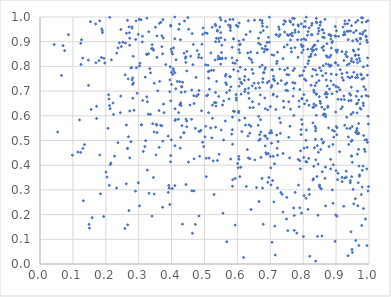
| Category | Series 0 |
|---|---|
| 0.7711605829372568 | 0.711 |
| 0.8751625421166362 | 0.639 |
| 0.39453903070508095 | 0.697 |
| 0.8493857288119423 | 0.313 |
| 0.7195158844886088 | 0.812 |
| 0.27645805787305816 | 0.495 |
| 0.41170801864062745 | 0.585 |
| 0.6354703414734795 | 0.834 |
| 0.5506956713426243 | 0.543 |
| 0.3078551616094081 | 0.563 |
| 0.99832402196587 | 0.314 |
| 0.7428087557466541 | 0.985 |
| 0.9177270872909922 | 0.86 |
| 0.8621516920657131 | 0.494 |
| 0.5855382740461242 | 0.485 |
| 0.7195075052622896 | 0.522 |
| 0.9010816518673722 | 0.767 |
| 0.558158456904702 | 0.66 |
| 0.9147110279898966 | 0.628 |
| 0.5932864767063306 | 0.347 |
| 0.30235069661488817 | 0.802 |
| 0.1691621167150901 | 0.972 |
| 0.9329010332055457 | 0.775 |
| 0.21575233062682514 | 0.409 |
| 0.5095888499351072 | 0.684 |
| 0.6019825847755642 | 0.962 |
| 0.41004457369203334 | 0.479 |
| 0.9072391111265058 | 0.922 |
| 0.9965453725083775 | 0.985 |
| 0.4460981587290986 | 0.782 |
| 0.5651675680994291 | 0.768 |
| 0.37264741824684083 | 0.23 |
| 0.5329063640033712 | 0.971 |
| 0.8928878745340253 | 0.514 |
| 0.7565571000430683 | 0.766 |
| 0.7387678521535422 | 0.448 |
| 0.9638483434946638 | 0.766 |
| 0.5673042113792204 | 0.694 |
| 0.5208401684835107 | 0.784 |
| 0.5320868761976879 | 0.826 |
| 0.713725984316383 | 0.153 |
| 0.7692572739563064 | 0.783 |
| 0.5452912526476306 | 0.835 |
| 0.9651988906121346 | 0.651 |
| 0.8976293564046353 | 0.814 |
| 0.6556205656251907 | 0.712 |
| 0.6580528443994358 | 0.31 |
| 0.8236654320407847 | 0.724 |
| 0.424644073304481 | 0.645 |
| 0.2762782842435201 | 0.793 |
| 0.8270115831850884 | 0.928 |
| 0.6224490643679649 | 0.698 |
| 0.9670124829021873 | 0.532 |
| 0.9473822885446638 | 0.354 |
| 0.8395232519904454 | 0.98 |
| 0.6054603685863158 | 0.976 |
| 0.6676435004039112 | 0.523 |
| 0.8400344397815985 | 0.687 |
| 0.6689526287448277 | 0.988 |
| 0.8592218468099098 | 0.919 |
| 0.9780697841130057 | 0.679 |
| 0.6940758271347474 | 0.447 |
| 0.8296055849705847 | 0.571 |
| 0.8901500045683148 | 0.484 |
| 0.5105092441688837 | 0.805 |
| 0.9659915070407531 | 0.236 |
| 0.9330475407368761 | 0.549 |
| 0.9537452982392398 | 0.243 |
| 0.564262352893815 | 0.833 |
| 0.5082001536083901 | 0.934 |
| 0.22349007695760315 | 0.606 |
| 0.818322882439604 | 0.956 |
| 0.9463033813003014 | 0.822 |
| 0.8300261366648447 | 0.788 |
| 0.4056915558818672 | 0.875 |
| 0.5473689238375701 | 0.997 |
| 0.1719978114523279 | 0.589 |
| 0.912565699687872 | 0.787 |
| 0.28593897796618 | 0.622 |
| 0.8677466566914165 | 0.604 |
| 0.959512672438834 | 0.978 |
| 0.8295735617689002 | 0.879 |
| 0.9729993043356996 | 0.631 |
| 0.8402602772546586 | 0.734 |
| 0.48107783656400294 | 0.686 |
| 0.6520851093956156 | 0.987 |
| 0.9610344994491321 | 0.945 |
| 0.37053642296080697 | 0.924 |
| 0.2688233654134753 | 0.515 |
| 0.12983186986284273 | 0.834 |
| 0.5747031084820395 | 0.668 |
| 0.7615593843122219 | 0.907 |
| 0.3245397886949745 | 0.677 |
| 0.928126018044939 | 0.849 |
| 0.2815390729394334 | 0.753 |
| 0.6400941474604511 | 0.858 |
| 0.7939759701487477 | 0.888 |
| 0.8270796290500866 | 0.975 |
| 0.9907078865438204 | 0.923 |
| 0.530289568712401 | 0.654 |
| 0.6333621758154225 | 0.692 |
| 0.31195015970112394 | 0.662 |
| 0.7896135389353639 | 0.762 |
| 0.13041026808187378 | 0.468 |
| 0.2332103351536719 | 0.854 |
| 0.3305808013392757 | 0.94 |
| 0.6135661263990688 | 0.536 |
| 0.8697157253454906 | 0.81 |
| 0.773411598831692 | 0.791 |
| 0.14742039386921033 | 0.723 |
| 0.8057646456759321 | 0.983 |
| 0.9107370716156966 | 0.455 |
| 0.49397936428337513 | 0.493 |
| 0.9915907820068258 | 0.682 |
| 0.4684366163504262 | 0.426 |
| 0.6905632338956679 | 0.508 |
| 0.27957907172677426 | 0.955 |
| 0.8781155024161349 | 0.929 |
| 0.18951677523716334 | 0.945 |
| 0.14685304446344472 | 0.825 |
| 0.5015532792049618 | 0.515 |
| 0.8177334671425405 | 0.643 |
| 0.8327660930915838 | 0.635 |
| 0.9859596630153588 | 0.465 |
| 0.8413861739828923 | 0.976 |
| 0.46119977019753317 | 0.704 |
| 0.8798758684185591 | 0.709 |
| 0.5335726349442905 | 0.694 |
| 0.7062297070629738 | 0.786 |
| 0.6102534619915282 | 0.736 |
| 0.7559584115299764 | 0.513 |
| 0.8025811665734857 | 0.277 |
| 0.11520284125392555 | 0.453 |
| 0.5020788560967102 | 0.936 |
| 0.6264835779492759 | 0.929 |
| 0.9696821482926654 | 0.397 |
| 0.39709535436909826 | 0.966 |
| 0.5639978098335352 | 0.983 |
| 0.44949084348430457 | 0.998 |
| 0.35497075738565553 | 0.562 |
| 0.2579654670556895 | 0.144 |
| 0.8643048286700615 | 0.916 |
| 0.9263178122113254 | 0.348 |
| 0.9337757512954749 | 0.839 |
| 0.7897712152326806 | 0.227 |
| 0.4721635329619892 | 0.549 |
| 0.2909686899811961 | 0.909 |
| 0.9024649373039301 | 0.194 |
| 0.6006854462547685 | 0.407 |
| 0.606284495081808 | 0.888 |
| 0.5533478184677377 | 0.83 |
| 0.665703684860284 | 0.253 |
| 0.6112643010225183 | 0.688 |
| 0.8547990945771382 | 0.783 |
| 0.6712598274182832 | 0.535 |
| 0.9826990861956727 | 0.652 |
| 0.3253721555617913 | 0.848 |
| 0.5052452832509677 | 0.428 |
| 0.9270033680454706 | 0.929 |
| 0.09845857163681646 | 0.441 |
| 0.43780937935843933 | 0.531 |
| 0.9367170703998352 | 0.908 |
| 0.27845914203715716 | 0.795 |
| 0.4371640096461267 | 0.532 |
| 0.6390624749552833 | 0.941 |
| 0.6867126551671554 | 0.451 |
| 0.7460012995572379 | 0.727 |
| 0.3510121453158217 | 0.959 |
| 0.2667285275218978 | 0.159 |
| 0.9954034094587675 | 0.493 |
| 0.6858721851136328 | 0.518 |
| 0.7964281606629157 | 0.668 |
| 0.8982489011048216 | 0.816 |
| 0.29288296075197334 | 0.795 |
| 0.8676882512956995 | 0.392 |
| 0.8731842802906706 | 0.838 |
| 0.8478393640977812 | 0.943 |
| 0.8598007346695478 | 0.948 |
| 0.4217965128064049 | 0.95 |
| 0.8082192169408857 | 0.501 |
| 0.4517179668675607 | 0.95 |
| 0.2726057935302772 | 0.619 |
| 0.8661357943896599 | 0.347 |
| 0.2519739930685066 | 0.898 |
| 0.2725954228671802 | 0.914 |
| 0.8397818458597933 | 0.689 |
| 0.9957616120225677 | 0.834 |
| 0.5034034086202201 | 0.806 |
| 0.23678128518276478 | 0.491 |
| 0.7493418731334239 | 0.182 |
| 0.11997307305694438 | 0.583 |
| 0.20681102779588112 | 0.549 |
| 0.9688434959604209 | 0.664 |
| 0.7095474199470374 | 0.76 |
| 0.9432497440296373 | 0.329 |
| 0.5845640922884495 | 0.544 |
| 0.7001060617986283 | 0.637 |
| 0.4830215885377695 | 0.849 |
| 0.9827417085057787 | 0.939 |
| 0.7098046244521439 | 0.747 |
| 0.9456813674657398 | 0.662 |
| 0.6891138723131199 | 0.867 |
| 0.7944981804638902 | 0.909 |
| 0.6450685643736132 | 0.816 |
| 0.34252154690318604 | 0.568 |
| 0.6788849514796488 | 0.945 |
| 0.6049698545383576 | 0.903 |
| 0.7461468153585468 | 0.981 |
| 0.8668690854319006 | 0.688 |
| 0.7933930321710019 | 0.544 |
| 0.34506034079002007 | 0.865 |
| 0.8361928585876932 | 0.722 |
| 0.5491635275263154 | 0.937 |
| 0.8007727639555351 | 0.111 |
| 0.4261422145348944 | 0.469 |
| 0.2704229330406899 | 0.96 |
| 0.9488562939718288 | 0.556 |
| 0.7218138048230403 | 0.308 |
| 0.8402369513063996 | 0.87 |
| 0.838743167363523 | 0.642 |
| 0.37522753244696755 | 0.647 |
| 0.3972680511140416 | 0.439 |
| 0.8948823455867333 | 0.537 |
| 0.7287751613922419 | 0.789 |
| 0.9362199711785151 | 0.757 |
| 0.6977148789080398 | 0.531 |
| 0.18379270783433646 | 0.284 |
| 0.8180483401567633 | 0.839 |
| 0.398768527460391 | 0.503 |
| 0.12385447794143337 | 0.893 |
| 0.62715704144417 | 0.314 |
| 0.44107740650883603 | 0.697 |
| 0.8147478328862022 | 0.221 |
| 0.8579022861516921 | 0.373 |
| 0.399731388578924 | 0.727 |
| 0.2986749450505367 | 0.329 |
| 0.5621680528836589 | 0.907 |
| 0.4432271902458932 | 0.839 |
| 0.4624782684093054 | 0.933 |
| 0.43164972383788897 | 0.56 |
| 0.8445161982814628 | 0.903 |
| 0.6375169053848097 | 0.529 |
| 0.8840076276635579 | 0.923 |
| 0.39452541633776983 | 0.241 |
| 0.7438797554310224 | 0.786 |
| 0.7523991483505621 | 0.929 |
| 0.2703245080780076 | 0.216 |
| 0.962319354392975 | 0.54 |
| 0.8284230712986205 | 0.861 |
| 0.6356900118263784 | 0.563 |
| 0.12468296951147552 | 0.808 |
| 0.9688975442867499 | 0.528 |
| 0.9030923762940217 | 0.551 |
| 0.6828047132456984 | 0.869 |
| 0.7587371427122195 | 0.43 |
| 0.6659713811616986 | 0.648 |
| 0.5337655652416802 | 0.554 |
| 0.2586936204847599 | 0.766 |
| 0.6188459001574135 | 0.026 |
| 0.3389040775119019 | 0.872 |
| 0.9219458236026209 | 0.928 |
| 0.3974821014064471 | 0.963 |
| 0.7128304799679461 | 0.742 |
| 0.8648589831908171 | 0.626 |
| 0.5929746719305522 | 0.812 |
| 0.7026741234406133 | 0.54 |
| 0.40065637508181723 | 0.859 |
| 0.6968852409104367 | 0.898 |
| 0.4646735259784279 | 0.807 |
| 0.5393540821134152 | 0.419 |
| 0.4134652218729263 | 0.827 |
| 0.38957781179200895 | 0.518 |
| 0.7297265640800872 | 0.928 |
| 0.9456939708835773 | 0.606 |
| 0.6058456649900827 | 0.582 |
| 0.7871581807170295 | 0.66 |
| 0.3702160953472365 | 0.88 |
| 0.7679833677279967 | 0.994 |
| 0.8024039341046981 | 0.911 |
| 0.3736544612977366 | 0.99 |
| 0.29183958770519536 | 0.984 |
| 0.49559768204472343 | 0.956 |
| 0.9626381693648621 | 0.828 |
| 0.7863267500076375 | 0.94 |
| 0.7629869194787915 | 0.873 |
| 0.23273073679824408 | 0.307 |
| 0.7360430216707774 | 0.282 |
| 0.8165734654028395 | 0.823 |
| 0.42784574201191106 | 0.652 |
| 0.41000027953413953 | 0.774 |
| 0.623401273247886 | 0.707 |
| 0.9339274211315317 | 0.806 |
| 0.3404481226844915 | 0.194 |
| 0.7748127718695047 | 0.876 |
| 0.26582843043865606 | 0.987 |
| 0.885123342116709 | 0.769 |
| 0.4463396345243245 | 0.861 |
| 0.6086053652114852 | 0.796 |
| 0.7108598205905506 | 0.749 |
| 0.7275184822568057 | 0.59 |
| 0.8112493004785254 | 0.662 |
| 0.6811347080547966 | 0.858 |
| 0.836955403807591 | 0.847 |
| 0.15841690054300223 | 0.188 |
| 0.7516914707732044 | 0.888 |
| 0.3984041078188914 | 0.87 |
| 0.995178607479965 | 0.803 |
| 0.36787707683533927 | 0.979 |
| 0.961454149635515 | 0.91 |
| 0.604652335632303 | 0.868 |
| 0.5803691588620411 | 0.717 |
| 0.855031228460403 | 0.304 |
| 0.5877319218245405 | 0.619 |
| 0.40960922813065154 | 1 |
| 0.9019480531758902 | 0.523 |
| 0.46333271751377 | 0.124 |
| 0.6683611971120664 | 0.797 |
| 0.7043366786738406 | 0.531 |
| 0.9682038065965543 | 0.845 |
| 0.8138788454070346 | 0.869 |
| 0.8000529067708525 | 0.883 |
| 0.36312862918527716 | 0.974 |
| 0.8697987034487356 | 0.695 |
| 0.19689896747388963 | 0.814 |
| 0.6211686721208839 | 0.744 |
| 0.6695832416233367 | 0.506 |
| 0.7542440292043253 | 0.925 |
| 0.2728546960905318 | 0.43 |
| 0.9528734219573229 | 0.817 |
| 0.8399999326800731 | 0.602 |
| 0.5138316722180228 | 0.781 |
| 0.8323092171486479 | 0.866 |
| 0.6827231288665753 | 0.519 |
| 0.4745997601324546 | 0.755 |
| 0.5730246520193012 | 0.967 |
| 0.4097688243002432 | 0.912 |
| 0.35354879818421703 | 0.565 |
| 0.5150876295884095 | 0.708 |
| 0.7560296964581057 | 0.657 |
| 0.2086160898022995 | 0.685 |
| 0.9791500577555505 | 0.312 |
| 0.5063994978550853 | 0.681 |
| 0.7205620142385393 | 0.678 |
| 0.7693244983368035 | 0.68 |
| 0.9370739039268255 | 0.514 |
| 0.5772962486603154 | 0.99 |
| 0.771080091277007 | 0.227 |
| 0.849873102502052 | 0.794 |
| 0.6136007524813372 | 0.73 |
| 0.7503864361819178 | 0.733 |
| 0.5291750805608938 | 0.281 |
| 0.34086967191600415 | 0.888 |
| 0.8256979238183488 | 0.966 |
| 0.977138126072821 | 0.997 |
| 0.9584757787091126 | 0.264 |
| 0.9462374428028234 | 0.716 |
| 0.9311317372470012 | 0.858 |
| 0.9650904609647237 | 0.815 |
| 0.38218687788296013 | 0.808 |
| 0.7001688911797471 | 0.436 |
| 0.9262717822049034 | 0.562 |
| 0.9384648996379865 | 0.661 |
| 0.5493237952442716 | 0.809 |
| 0.7949401812505364 | 0.585 |
| 0.4833329331800629 | 0.538 |
| 0.922041277556681 | 0.744 |
| 0.8094330990295837 | 0.542 |
| 0.5867968271767966 | 0.99 |
| 0.7532505672974126 | 0.135 |
| 0.4377240463617317 | 0.853 |
| 0.9182272704535379 | 0.755 |
| 0.4174827168288607 | 0.739 |
| 0.1720537349836061 | 0.638 |
| 0.2656668514396495 | 0.468 |
| 0.15020800012693317 | 0.145 |
| 0.8630416571325575 | 0.935 |
| 0.7403532173804751 | 0.971 |
| 0.5676497899607892 | 0.09 |
| 0.881185066124577 | 0.8 |
| 0.5392979142091858 | 0.946 |
| 0.3197596502281327 | 0.756 |
| 0.874773047642318 | 0.634 |
| 0.9494868465179873 | 0.047 |
| 0.7616923591435225 | 0.98 |
| 0.8840433065280588 | 0.741 |
| 0.8873698437608835 | 0.896 |
| 0.8329342651140392 | 0.695 |
| 0.3974824121072869 | 0.661 |
| 0.8321896529055153 | 0.704 |
| 0.9970260089135801 | 0.295 |
| 0.7505913352188376 | 0.767 |
| 0.4393258962026945 | 0.984 |
| 0.5475158496047479 | 0.831 |
| 0.8834441119568279 | 0.385 |
| 0.3580454733364921 | 0.701 |
| 0.579392591432403 | 0.425 |
| 0.3473840556635869 | 0.732 |
| 0.1878942755134956 | 0.952 |
| 0.4756561554366724 | 0.679 |
| 0.90061126958144 | 0.557 |
| 0.7966675605772477 | 0.764 |
| 0.8451220976154666 | 0.197 |
| 0.8891579987827778 | 0.901 |
| 0.6479492107904902 | 0.771 |
| 0.7967988668216802 | 0.565 |
| 0.9178321267589526 | 0.771 |
| 0.6762161075698487 | 0.963 |
| 0.6053463564678672 | 0.72 |
| 0.9656048504440973 | 0.755 |
| 0.9778718467985177 | 0.156 |
| 0.4331061620467363 | 0.161 |
| 0.3040504360583623 | 0.813 |
| 0.7411201677310502 | 0.634 |
| 0.42132075544609776 | 0.613 |
| 0.9423910681149987 | 0.549 |
| 0.5634153561367835 | 0.579 |
| 0.7304599827518604 | 0.529 |
| 0.8386077091471619 | 0.55 |
| 0.9310657854527578 | 0.351 |
| 0.46767163206909274 | 0.681 |
| 0.6509099752681267 | 0.732 |
| 0.982154943833678 | 0.396 |
| 0.8019799115844307 | 0.686 |
| 0.9443548370153145 | 0.683 |
| 0.36673764595747105 | 0.561 |
| 0.79481836199048 | 0.206 |
| 0.9883928517895336 | 0.455 |
| 0.899414384486722 | 0.719 |
| 0.5445709570438855 | 0.901 |
| 0.6638434359647658 | 0.732 |
| 0.5140219119083292 | 0.429 |
| 0.6036313682939297 | 0.612 |
| 0.8888775090484855 | 0.542 |
| 0.8886470696959929 | 0.3 |
| 0.8040019568446383 | 0.649 |
| 0.7523756938099185 | 0.793 |
| 0.15348616496662149 | 0.981 |
| 0.8609241553949961 | 0.803 |
| 0.9515679234902699 | 0.302 |
| 0.5501183784235418 | 0.988 |
| 0.6752392243396867 | 0.873 |
| 0.44330978975010815 | 0.816 |
| 0.8708660342289265 | 0.675 |
| 0.9635306212963085 | 0.549 |
| 0.8467263746975511 | 0.954 |
| 0.3263076356449439 | 0.38 |
| 0.9252631567301767 | 0.666 |
| 0.9765232716625569 | 0.281 |
| 0.39002692168323727 | 0.29 |
| 0.9514941611460235 | 0.614 |
| 0.6909474744917194 | 0.734 |
| 0.9450358146770959 | 0.13 |
| 0.5784667049918863 | 0.965 |
| 0.2794266701395784 | 0.96 |
| 0.696968350242031 | 0.999 |
| 0.26282905215640934 | 0.934 |
| 0.7729075114115008 | 0.136 |
| 0.6793317152301092 | 0.775 |
| 0.8683459789960657 | 0.235 |
| 0.8058834148795457 | 0.797 |
| 0.7915138227749277 | 0.385 |
| 0.4615524117695875 | 0.296 |
| 0.9843739230916208 | 0.718 |
| 0.9383086310309615 | 0.484 |
| 0.7168382247695156 | 0.625 |
| 0.7942727697185741 | 0.972 |
| 0.5527610808642313 | 0.886 |
| 0.194428954219665 | 0.833 |
| 0.4250188795701377 | 0.738 |
| 0.043138388859500644 | 0.889 |
| 0.7233693741388557 | 0.496 |
| 0.8295774621681724 | 0.34 |
| 0.9929525189353322 | 0.503 |
| 0.3069679059410053 | 0.989 |
| 0.9638760703796598 | 0.612 |
| 0.6899299610668531 | 0.96 |
| 0.8919129096748841 | 0.726 |
| 0.6692354603976798 | 0.684 |
| 0.732138861123476 | 0.289 |
| 0.5966729662055609 | 0.664 |
| 0.6068150192192927 | 0.75 |
| 0.7898788996629198 | 0.707 |
| 0.7220170604470296 | 0.857 |
| 0.32354761098682006 | 0.849 |
| 0.9734148763789099 | 0.914 |
| 0.8128970653366813 | 0.926 |
| 0.8271233461806977 | 0.76 |
| 0.9236573453171354 | 0.824 |
| 0.18669220022246144 | 0.836 |
| 0.644725228514485 | 0.721 |
| 0.9795572556952837 | 0.379 |
| 0.8967526914801113 | 0.924 |
| 0.41048965642726043 | 0.628 |
| 0.42693638618080143 | 0.908 |
| 0.5561217551601357 | 0.206 |
| 0.8991528118377348 | 0.865 |
| 0.4019981442528996 | 0.306 |
| 0.644779916766978 | 0.787 |
| 0.3338725862138663 | 0.791 |
| 0.3554309696253765 | 0.836 |
| 0.9621441101687565 | 0.648 |
| 0.5241933124061617 | 0.643 |
| 0.9178905817952828 | 0.351 |
| 0.8728946716832453 | 0.721 |
| 0.7037986873520837 | 0.489 |
| 0.8002133508619729 | 0.867 |
| 0.725488722216626 | 0.959 |
| 0.5517246010575744 | 0.856 |
| 0.9516080178016207 | 0.866 |
| 0.5547085765145369 | 0.644 |
| 0.4820413887992049 | 0.836 |
| 0.3263786350645215 | 0.656 |
| 0.7332675532091961 | 0.743 |
| 0.6357615939306528 | 0.67 |
| 0.18184688115729333 | 0.442 |
| 0.5857068342785963 | 0.341 |
| 0.9671847295501781 | 0.329 |
| 0.7178009344207825 | 0.928 |
| 0.6320857998486548 | 0.518 |
| 0.15541082862988173 | 0.626 |
| 0.8379748861324784 | 0.012 |
| 0.8905197119256185 | 0.246 |
| 0.4301103201334529 | 0.717 |
| 0.6700163910350784 | 0.584 |
| 0.5850412579340593 | 0.315 |
| 0.9937790434378749 | 0.075 |
| 0.9184792991404073 | 0.333 |
| 0.6701240244505183 | 0.889 |
| 0.5389744012528935 | 0.943 |
| 0.5280404414731111 | 0.784 |
| 0.7842989548254834 | 0.837 |
| 0.7598827408366622 | 0.558 |
| 0.5498099103460823 | 0.916 |
| 0.994687794383845 | 0.898 |
| 0.4606819067812041 | 0.586 |
| 0.46824592824653055 | 0.65 |
| 0.9155735669986632 | 0.666 |
| 0.905955839155906 | 0.667 |
| 0.2819523099112037 | 0.671 |
| 0.34696194818548165 | 0.283 |
| 0.12617455964137847 | 0.908 |
| 0.6604650118019332 | 0.855 |
| 0.9503321352947288 | 0.904 |
| 0.9649148730856035 | 0.7 |
| 0.6845123528009015 | 0.478 |
| 0.410616204850735 | 0.581 |
| 0.4945739931278208 | 0.93 |
| 0.8917027238232899 | 0.402 |
| 0.6754111026877678 | 0.805 |
| 0.7848863900279199 | 0.423 |
| 0.6377626511650165 | 0.426 |
| 0.4921508249936762 | 0.89 |
| 0.8358868787160467 | 0.558 |
| 0.881226852811544 | 0.928 |
| 0.9659454655866619 | 0.986 |
| 0.39683717427629034 | 0.414 |
| 0.6225435451739183 | 0.591 |
| 0.8608555734501168 | 0.604 |
| 0.9233385859281281 | 0.234 |
| 0.9066710630101787 | 0.715 |
| 0.7397129138769526 | 0.66 |
| 0.925137387225945 | 0.939 |
| 0.9337781927244876 | 0.942 |
| 0.346773749333297 | 0.535 |
| 0.8385178442615098 | 0.422 |
| 0.9542554637392852 | 0.862 |
| 0.8620285408550532 | 0.865 |
| 0.7028151132608162 | 0.715 |
| 0.9379758165503069 | 0.942 |
| 0.7693178776669587 | 0.969 |
| 0.3187477576660257 | 0.476 |
| 0.5968476492525859 | 0.672 |
| 0.9647883434252488 | 0.445 |
| 0.2597263997612199 | 0.895 |
| 0.8142630437719743 | 0.811 |
| 0.3313904260845929 | 0.286 |
| 0.946698972512524 | 0.965 |
| 0.8375650590123567 | 0.539 |
| 0.3994123346559137 | 0.776 |
| 0.5913036309341911 | 0.617 |
| 0.8589631864645288 | 0.762 |
| 0.7961461178844886 | 0.88 |
| 0.6302142272534216 | 0.463 |
| 0.9010481431587828 | 0.944 |
| 0.9830223114081846 | 0.642 |
| 0.8430365672283896 | 0.479 |
| 0.472295440862817 | 0.16 |
| 0.511717780988038 | 0.779 |
| 0.9433400899493756 | 0.337 |
| 0.44606752485537143 | 0.556 |
| 0.7752499499939899 | 0.938 |
| 0.6418857513852345 | 0.828 |
| 0.5579555532569036 | 0.502 |
| 0.8855260668711175 | 0.874 |
| 0.8512094508112972 | 0.659 |
| 0.7054766139265679 | 0.786 |
| 0.2105109355388202 | 0.319 |
| 0.4832966251556318 | 0.194 |
| 0.31088676521790926 | 0.899 |
| 0.2413568579568979 | 0.896 |
| 0.9119035307398793 | 0.705 |
| 0.2442973296112875 | 0.612 |
| 0.8512600634050853 | 0.967 |
| 0.5959908749361742 | 0.686 |
| 0.5415090633488698 | 0.842 |
| 0.9760080796812055 | 0.627 |
| 0.624779575933786 | 0.563 |
| 0.18164141643186704 | 0.984 |
| 0.8497758065756469 | 0.32 |
| 0.22185570850889214 | 0.652 |
| 0.7181623361039677 | 0.928 |
| 0.33009119091814776 | 0.851 |
| 0.7754120838207756 | 0.29 |
| 0.3209545329775158 | 0.499 |
| 0.9974792982279354 | 0.679 |
| 0.710819948945795 | 0.845 |
| 0.7208217380358629 | 0.469 |
| 0.4098859250454387 | 0.317 |
| 0.40522405653762505 | 0.791 |
| 0.45126096126683046 | 0.412 |
| 0.8314558648197504 | 0.345 |
| 0.6901749799123092 | 0.897 |
| 0.7670042313806599 | 0.924 |
| 0.692438835855494 | 0.624 |
| 0.5643375236550567 | 0.734 |
| 0.5339692075884978 | 0.9 |
| 0.5409528537656545 | 0.83 |
| 0.4128947750839943 | 0.709 |
| 0.6087094663197037 | 0.89 |
| 0.2455064488526144 | 0.68 |
| 0.9743075874080533 | 0.911 |
| 0.7956122360912914 | 0.856 |
| 0.8596934154715948 | 0.49 |
| 0.39583895424692456 | 0.799 |
| 0.5265720190272571 | 0.417 |
| 0.663090003565809 | 0.562 |
| 0.8079007184342392 | 0.907 |
| 0.845342929713947 | 0.404 |
| 0.6957353177738739 | 0.74 |
| 0.46794655855268474 | 0.296 |
| 0.896987811114412 | 0.091 |
| 0.4831375845878784 | 0.703 |
| 0.8398395510909542 | 0.994 |
| 0.05380061957575878 | 0.535 |
| 0.6956068976174288 | 0.35 |
| 0.8700696662346972 | 0.745 |
| 0.7474875160237839 | 0.703 |
| 0.5841801448587602 | 0.877 |
| 0.8986288014786946 | 0.922 |
| 0.9536217322692063 | 0.937 |
| 0.9027379180856555 | 0.857 |
| 0.96894033573154 | 0.075 |
| 0.676509075365346 | 0.307 |
| 0.9469517907432801 | 0.437 |
| 0.9041092563522126 | 0.866 |
| 0.9683100139248799 | 0.464 |
| 0.8776416728723563 | 0.807 |
| 0.9949747454886191 | 0.765 |
| 0.7751436106687847 | 0.948 |
| 0.7961990273972375 | 0.671 |
| 0.578431156464043 | 0.957 |
| 0.832303108042362 | 0.648 |
| 0.8686502557242594 | 0.772 |
| 0.7128281076352163 | 0.406 |
| 0.45590056776936144 | 0.644 |
| 0.6770445319955533 | 0.736 |
| 0.32926452249704974 | 0.606 |
| 0.9918329321518256 | 0.981 |
| 0.505498363447012 | 0.354 |
| 0.9684517842364984 | 0.569 |
| 0.7386665846236418 | 0.831 |
| 0.21372153046515463 | 0.403 |
| 0.490799015306503 | 0.834 |
| 0.17932947803658114 | 0.823 |
| 0.9396632784168536 | 0.986 |
| 0.946207677317268 | 0.496 |
| 0.6852261902903 | 0.882 |
| 0.878502705184076 | 0.475 |
| 0.9749281029182117 | 0.769 |
| 0.2038709592674996 | 0.352 |
| 0.6042894510912028 | 0.618 |
| 0.8199937886529309 | 0.031 |
| 0.8358839192860348 | 0.886 |
| 0.5036540255909043 | 0.558 |
| 0.39488080482765553 | 0.746 |
| 0.8082033164929832 | 0.415 |
| 0.8530506611137928 | 0.464 |
| 0.8370903824447955 | 0.505 |
| 0.9787663731451559 | 0.748 |
| 0.7022563060871585 | 0.32 |
| 0.6773766034590636 | 0.75 |
| 0.20967719813376282 | 0.668 |
| 0.9307792765238536 | 0.376 |
| 0.44586546992342113 | 0.579 |
| 0.2623228545658497 | 0.325 |
| 0.44374622862667434 | 0.322 |
| 0.9707248203118204 | 0.832 |
| 0.443670658815829 | 0.587 |
| 0.982969702898975 | 0.798 |
| 0.39133068404272875 | 0.318 |
| 0.4891005624297938 | 0.541 |
| 0.6021949840484295 | 0.781 |
| 0.6650069917312509 | 0.501 |
| 0.5222106161522038 | 0.511 |
| 0.6833447800202217 | 0.789 |
| 0.49097676337267293 | 0.62 |
| 0.7750509748999534 | 0.732 |
| 0.8478409113036347 | 0.742 |
| 0.853177909267381 | 0.306 |
| 0.20060878423610798 | 0.372 |
| 0.6706473807348206 | 0.937 |
| 0.21133221087860715 | 0.642 |
| 0.5768920075588029 | 0.759 |
| 0.9591456073424729 | 0.847 |
| 0.9894300514204875 | 0.707 |
| 0.6750304192174312 | 0.985 |
| 0.1899078444545978 | 0.937 |
| 0.3635352746442699 | 0.739 |
| 0.5985416559896407 | 0.824 |
| 0.21195102662476828 | 0.998 |
| 0.9916167945803332 | 0.92 |
| 0.6074417370627793 | 0.354 |
| 0.823049891804301 | 0.841 |
| 0.3249098763010523 | 0.995 |
| 0.427693930276142 | 0.513 |
| 0.7311058934364681 | 0.572 |
| 0.7088047244910564 | 0.436 |
| 0.2626563951583339 | 0.563 |
| 0.8527595017107039 | 0.98 |
| 0.2814367543372756 | 0.727 |
| 0.749951685463759 | 0.269 |
| 0.26800247841278824 | 0.749 |
| 0.9711052124054289 | 0.361 |
| 0.8372508852789721 | 0.785 |
| 0.7687215132693812 | 0.735 |
| 0.8094952665021607 | 0.999 |
| 0.7069890889498137 | 0.338 |
| 0.9346227423393066 | 0.973 |
| 0.8190432444917641 | 0.282 |
| 0.35551413471413945 | 0.924 |
| 0.8419955584182142 | 0.354 |
| 0.3621859788478495 | 0.472 |
| 0.9835178681432757 | 0.52 |
| 0.606736077753265 | 0.856 |
| 0.947437170839958 | 0.437 |
| 0.8015688011125905 | 0.782 |
| 0.8342579077244092 | 0.471 |
| 0.9060476968851843 | 0.805 |
| 0.9408851517893448 | 0.69 |
| 0.37284794144963584 | 0.851 |
| 0.8449185155395947 | 0.932 |
| 0.19343969264582744 | 0.192 |
| 0.8118777361745332 | 0.472 |
| 0.6339612235557601 | 0.712 |
| 0.6024794131013542 | 0.39 |
| 0.5965015993282764 | 0.966 |
| 0.3732984320894746 | 0.497 |
| 0.7938275107623923 | 0.524 |
| 0.8067048998641183 | 0.961 |
| 0.3025129388419617 | 0.236 |
| 0.6921985426830124 | 0.331 |
| 0.6914217509452953 | 0.869 |
| 0.13181817942673435 | 0.256 |
| 0.37717898467907707 | 0.613 |
| 0.4036777926158072 | 0.768 |
| 0.631384978131388 | 0.854 |
| 0.5781313341708207 | 0.757 |
| 0.14915401207847598 | 0.16 |
| 0.9211139248926024 | 0.959 |
| 0.7830604067304048 | 0.908 |
| 0.710741227718863 | 0.251 |
| 0.8679711012332907 | 0.596 |
| 0.7857014725328817 | 0.964 |
| 0.2952565495649599 | 0.691 |
| 0.9981092723557091 | 0.567 |
| 0.8833679058268046 | 0.424 |
| 0.8169939585377292 | 0.428 |
| 0.7729392313879174 | 0.196 |
| 0.5367642806083722 | 0.739 |
| 0.3084111175389443 | 0.564 |
| 0.8568778776165614 | 0.114 |
| 0.7526751044520804 | 0.702 |
| 0.4973782682112698 | 0.476 |
| 0.5192953952588483 | 0.854 |
| 0.441913033314365 | 0.833 |
| 0.9190479508156432 | 0.636 |
| 0.5443731425886614 | 0.444 |
| 0.8573381991834168 | 0.876 |
| 0.06519166591013693 | 0.763 |
| 0.8246654954478998 | 0.929 |
| 0.4578784499044245 | 0.841 |
| 0.9788802021002754 | 0.979 |
| 0.5637308216684537 | 0.761 |
| 0.8850074897087717 | 0.804 |
| 0.29028620063371785 | 0.295 |
| 0.66427352592883 | 0.914 |
| 0.3527552023182272 | 0.442 |
| 0.7384588389294641 | 0.21 |
| 0.8997920196260557 | 0.378 |
| 0.9234746109019154 | 0.68 |
| 0.6716056723202566 | 0.432 |
| 0.428494066286298 | 0.642 |
| 0.23702246504651037 | 0.875 |
| 0.5880417375411227 | 0.911 |
| 0.5123119939672106 | 0.613 |
| 0.5232962462867231 | 0.959 |
| 0.973016769445638 | 0.891 |
| 0.7615074466096212 | 0.627 |
| 0.6241666668321764 | 0.787 |
| 0.6412469771499255 | 0.557 |
| 0.5347010225593894 | 0.653 |
| 0.6806519939589121 | 0.774 |
| 0.3618536960763167 | 0.621 |
| 0.6833015590863027 | 0.672 |
| 0.678698364614976 | 0.161 |
| 0.94828118779909 | 0.059 |
| 0.8174121681535785 | 0.302 |
| 0.5532068228716517 | 0.834 |
| 0.6382833355209181 | 0.633 |
| 0.7152221021520593 | 0.036 |
| 0.3746353485078648 | 0.915 |
| 0.8876640692795686 | 0.689 |
| 0.824085405294715 | 0.85 |
| 0.884051179360036 | 0.91 |
| 0.29891858083989975 | 0.93 |
| 0.6644133727597636 | 0.894 |
| 0.674953338017107 | 0.347 |
| 0.6942954592637218 | 0.918 |
| 0.9364077430508211 | 0.034 |
| 0.7876451493681247 | 0.637 |
| 0.9804876690472508 | 0.996 |
| 0.8733209742695218 | 0.688 |
| 0.771486459508198 | 0.601 |
| 0.6845313006014797 | 0.629 |
| 0.28385746269950995 | 0.733 |
| 0.8976752256969345 | 0.962 |
| 0.9581543827418798 | 0.844 |
| 0.5864341917174362 | 0.814 |
| 0.6225162036412345 | 0.759 |
| 0.7592432424290377 | 0.984 |
| 0.420692436192138 | 0.586 |
| 0.6040905289426328 | 0.436 |
| 0.8461874009535124 | 0.452 |
| 0.3355368719434979 | 0.606 |
| 0.6101368560234213 | 0.392 |
| 0.8319959206510402 | 0.396 |
| 0.40253995493845096 | 0.851 |
| 0.48523964328683605 | 0.436 |
| 0.4780081511689738 | 0.864 |
| 0.8837398820187138 | 0.845 |
| 0.30128766680347535 | 0.99 |
| 0.9400323580866686 | 0.811 |
| 0.9436327466536008 | 0.943 |
| 0.7918080559068756 | 0.458 |
| 0.993170946531712 | 0.385 |
| 0.9842094779275964 | 0.752 |
| 0.6330399859187693 | 0.43 |
| 0.8703400340231074 | 0.843 |
| 0.8014375022764958 | 0.961 |
| 0.4292376479323569 | 0.695 |
| 0.8612965391239087 | 0.881 |
| 0.5339858439067416 | 0.965 |
| 0.808569848530038 | 0.266 |
| 0.6645056083109839 | 0.598 |
| 0.0700186314084594 | 0.884 |
| 0.8435657170801334 | 0.112 |
| 0.604678485002965 | 0.424 |
| 0.7271785712528954 | 0.95 |
| 0.6755412662175063 | 0.974 |
| 0.5835324880984158 | 0.834 |
| 0.2715757386274448 | 0.937 |
| 0.8015299196891331 | 0.431 |
| 0.964805825296108 | 0.904 |
| 0.9595745152598234 | 0.095 |
| 0.3139669338085817 | 0.456 |
| 0.6849301204072192 | 0.795 |
| 0.12366751785496366 | 0.452 |
| 0.5788292844149503 | 0.945 |
| 0.21316117190767334 | 0.629 |
| 0.567052767876806 | 0.727 |
| 0.2471174793886488 | 0.88 |
| 0.645799778538667 | 0.657 |
| 0.5427479118553291 | 0.913 |
| 0.852493896656444 | 0.651 |
| 0.5240679818593743 | 0.59 |
| 0.5361390150360769 | 0.914 |
| 0.7898956675455058 | 0.419 |
| 0.8416822961247844 | 0.766 |
| 0.9471832997223463 | 0.832 |
| 0.7425232179295067 | 0.879 |
| 0.9890822777059193 | 0.945 |
| 0.8112069997881259 | 0.413 |
| 0.9045659212333799 | 0.342 |
| 0.8492187340415936 | 0.677 |
| 0.4058194689025107 | 0.783 |
| 0.9881417635414399 | 0.502 |
| 0.9723645384454112 | 0.822 |
| 0.7051879872586233 | 0.088 |
| 0.6340567261996602 | 0.747 |
| 0.26616223034228165 | 0.467 |
| 0.9324820316886197 | 0.839 |
| 0.2799416496844186 | 0.745 |
| 0.4313572969834599 | 0.718 |
| 0.3557306558660799 | 0.532 |
| 0.3703972736058821 | 0.56 |
| 0.283320054955621 | 0.841 |
| 0.9484153510074702 | 0.758 |
| 0.953840559516515 | 0.776 |
| 0.08645979337101682 | 0.929 |
| 0.6531497770664179 | 0.421 |
| 0.8630598678574778 | 0.608 |
| 0.5433419765570001 | 0.678 |
| 0.9487375095882211 | 0.501 |
| 0.983205205606771 | 0.224 |
| 0.3929531241065512 | 0.307 |
| 0.7051103140696621 | 0.847 |
| 0.7015451389879958 | 0.389 |
| 0.5184821411828594 | 0.551 |
| 0.8724126120787649 | 0.892 |
| 0.2265254987125633 | 0.437 |
| 0.6414337985624968 | 0.221 |
| 0.31136681444033854 | 0.922 |
| 0.4335733414188232 | 0.736 |
| 0.5850053309858377 | 0.595 |
| 0.7092615091334404 | 0.688 |
| 0.13526717308754818 | 0.483 |
| 0.9929491242136635 | 0.906 |
| 0.9800277287689306 | 0.93 |
| 0.815136651481712 | 0.941 |
| 0.9891089072675935 | 0.182 |
| 0.5349693843610769 | 0.639 |
| 0.8566485850653093 | 0.635 |
| 0.8847913759008118 | 0.924 |
| 0.8085869929348886 | 0.743 |
| 0.9612213046989054 | 0.679 |
| 0.6331724060596109 | 0.985 |
| 0.5124248728350137 | 0.752 |
| 0.6883869030409968 | 0.444 |
| 0.7661852018620668 | 0.935 |
| 0.8295827730687222 | 0.634 |
| 0.7220515535649691 | 0.441 |
| 0.8575562528940244 | 0.948 |
| 0.8026754626563306 | 0.469 |
| 0.8987410708304211 | 0.199 |
| 0.9681479290603626 | 0.869 |
| 0.9727722393071198 | 0.933 |
| 0.9597058178162827 | 0.755 |
| 0.6184437598286647 | 0.908 |
| 0.8559743114906868 | 0.505 |
| 0.4857306049950925 | 0.537 |
| 0.9493764569210409 | 0.412 |
| 0.9972165848969712 | 0.598 |
| 0.7727598581652778 | 0.994 |
| 0.2458304934396607 | 0.95 |
| 0.6480840829963369 | 0.633 |
| 0.926576492319622 | 0.972 |
| 0.2725328155581338 | 0.886 |
| 0.5932362473977172 | 0.157 |
| 0.34293380899773596 | 0.872 |
| 0.5886073914097748 | 0.787 |
| 0.9422195983100514 | 0.753 |
| 0.8526962235633689 | 0.978 |
| 0.7843501913217955 | 0.968 |
| 0.423696636453942 | 0.971 |
| 0.720391624185873 | 0.821 |
| 0.9025292857736318 | 0.698 |
| 0.9709300045395167 | 0.356 |
| 0.959504532456078 | 0.533 |
| 0.8798591473592612 | 0.837 |
| 0.8338005692742528 | 0.886 |
| 0.780597741625698 | 0.125 |
| 0.5881434855002364 | 0.912 |
| 0.8252665687659255 | 0.87 |
| 0.9325534997756452 | 0.594 |
| 0.5465773051385467 | 0.959 |
| 0.7605421507577641 | 0.929 |
| 0.9768562123866942 | 0.766 |
| 0.6674995048418481 | 0.714 |
| 0.465928527636215 | 0.889 |
| 0.9639027698823077 | 0.527 |
| 0.5764424546086482 | 0.703 |
| 0.7258802879608846 | 0.921 |
| 0.7643584604904607 | 0.859 |
| 0.7223958858936469 | 0.731 |
| 0.7049494572964693 | 0.723 |
| 0.16986187486412185 | 0.814 |
| 0.34469579225459196 | 0.35 |
| 0.33585427778451604 | 0.774 |
| 0.8772317379216262 | 0.551 |
| 0.92666630232203 | 0.984 |
| 0.07493188527228772 | 0.864 |
| 0.803881535042412 | 0.749 |
| 0.7438707532906318 | 0.939 |
| 0.9058995839142718 | 0.367 |
| 0.8988155143428394 | 0.615 |
| 0.7856931453285155 | 0.319 |
| 0.5827655552556518 | 0.526 |
| 0.708501510236457 | 0.684 |
| 0.21701468071926805 | 0.827 |
| 0.8663632242889998 | 0.99 |